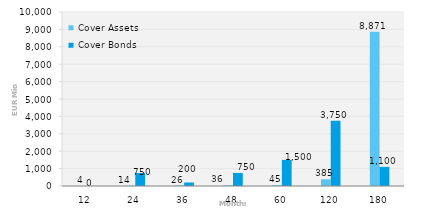
| Category | Cover Assets | Cover Bonds |
|---|---|---|
| 12.0 | 3.92 | 0 |
| 24.0 | 13.833 | 750 |
| 36.0 | 25.532 | 200 |
| 48.0 | 36.062 | 750 |
| 60.0 | 44.643 | 1500 |
| 120.0 | 385.278 | 3750 |
| 180.0 | 8871.418 | 1100 |